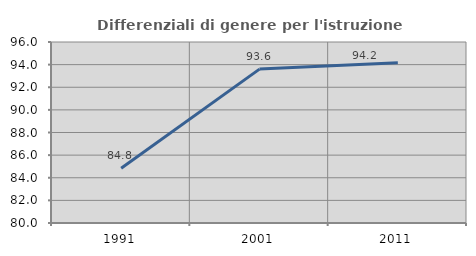
| Category | Differenziali di genere per l'istruzione superiore |
|---|---|
| 1991.0 | 84.844 |
| 2001.0 | 93.603 |
| 2011.0 | 94.156 |